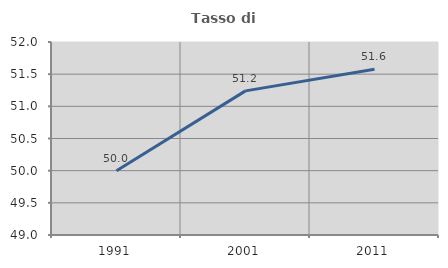
| Category | Tasso di occupazione   |
|---|---|
| 1991.0 | 50 |
| 2001.0 | 51.24 |
| 2011.0 | 51.576 |